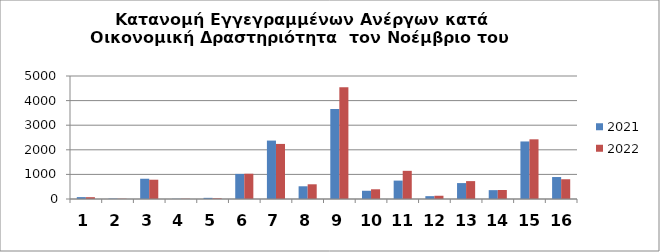
| Category | 2021 | 2022 |
|---|---|---|
| 0 | 77 | 74 |
| 1 | 16 | 10 |
| 2 | 824 | 784 |
| 3 | 8 | 10 |
| 4 | 47 | 27 |
| 5 | 1020 | 1028 |
| 6 | 2375 | 2239 |
| 7 | 517 | 598 |
| 8 | 3655 | 4544 |
| 9 | 335 | 395 |
| 10 | 748 | 1145 |
| 11 | 116 | 132 |
| 12 | 647 | 727 |
| 13 | 360 | 367 |
| 14 | 2339 | 2426 |
| 15 | 893 | 803 |